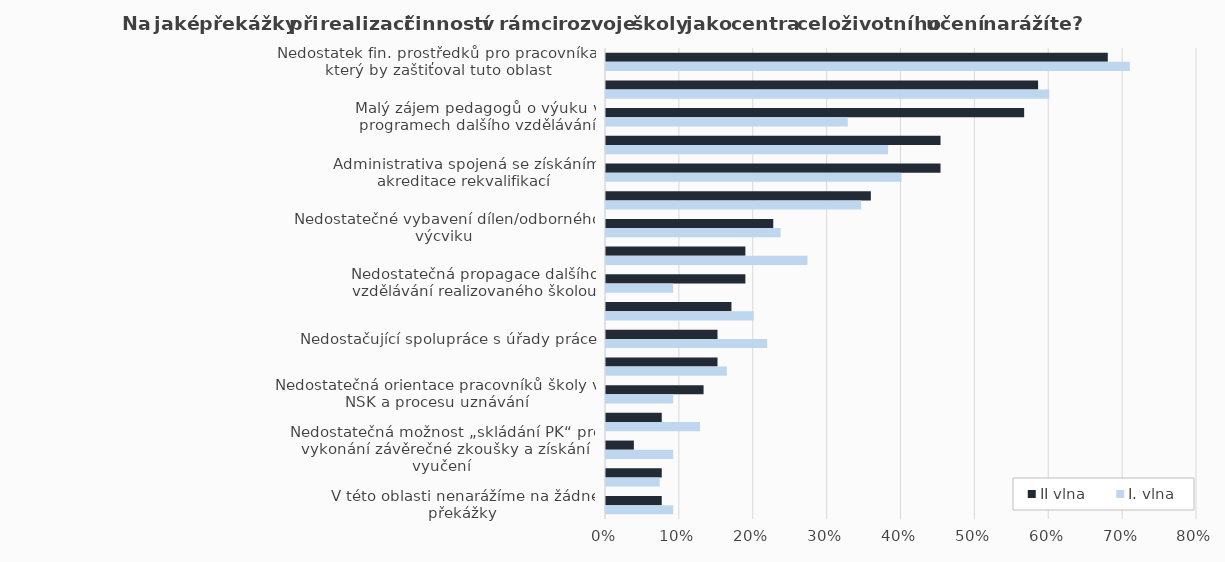
| Category | II vlna | I. vlna |
|---|---|---|
| Nedostatek fin. prostředků pro pracovníka, který by zaštiťoval tuto oblast | 0.679 | 0.709 |
| Malý zájem dospělých o další vzdělávání | 0.585 | 0.6 |
| Malý zájem pedagogů o výuku v programech dalšího vzdělávání | 0.566 | 0.327 |
| Malý zájem zaměstnavatelů o další vzdělávání | 0.453 | 0.382 |
| Administrativa spojená se získáním akreditace rekvalifikací | 0.453 | 0.4 |
| Náročné zpracování dokumentace potřebné k účasti ve výběrových řízeních | 0.358 | 0.345 |
| Nedostatečné vybavení dílen/odborného výcviku | 0.226 | 0.236 |
| Administrativní náročnost při získávání autorizace podle z. 179/2006 Sb. | 0.189 | 0.273 |
| Nedostatečná propagace dalšího vzdělávání realizovaného školou | 0.189 | 0.091 |
| Obtíže při tvorbě programů dalšího vzdělávání | 0.17 | 0.2 |
| Nedostačující spolupráce s úřady práce | 0.151 | 0.218 |
| Obtíže spojené s přípravou zkoušky podle z. 179/2006 Sb. | 0.151 | 0.164 |
| Nedostatečná orientace pracovníků školy v NSK a procesu uznávání | 0.132 | 0.091 |
| Omezený počet standardů profesních kvalifikací NSK | 0.075 | 0.127 |
| Nedostatečná možnost „skládání PK“ pro vykonání závěrečné zkoušky a získání vyučení | 0.038 | 0.091 |
| Jiné | 0.075 | 0.073 |
| V této oblasti nenarážíme na žádné překážky | 0.075 | 0.091 |